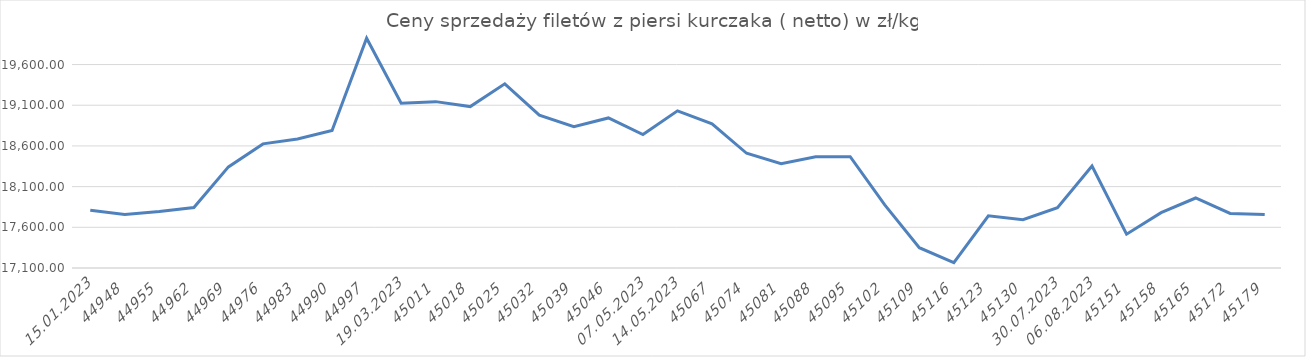
| Category | filety z piersi kurczaka |
|---|---|
| 15.01.2023 | 17810.023 |
| 22.01.2023 | 17757.926 |
| 29.01.2023 | 17793 |
| 05.02.2023 | 17843.588 |
| 12.02.2023 | 18342.585 |
| 19.02.2023 | 18625.115 |
| 26.02.2023 | 18684.334 |
| 05.03.2023 | 18790.139 |
| 12.03.2023 | 19923.104 |
| 19.03.2023 | 19124.42 |
| 26.03.2023 | 19144.344 |
| 02.04.2023 | 19083.679 |
| 09.04.2023 | 19363.01 |
| 16.04.2023 | 18978.751 |
| 23.04.2023 | 18835.817 |
| 30.04.2023 | 18943.698 |
| 07.05.2023 | 18739.473 |
| 14.05.2023 | 19031.403 |
| 21.05.2023 | 18870.303 |
| 28.05.2023 | 18509.819 |
| 04.06.2023 | 18381.437 |
| 11.06.2023 | 18466.889 |
| 18.06.2023 | 18467.889 |
| 25.06.2023 | 17874.914 |
| 02.07.2023 | 17349.174 |
| 09.07.2023 | 17165.546 |
| 16.07.2023 | 17741.248 |
| 23.07.2023 | 17694.338 |
| 30.07.2023 | 17841.429 |
| 06.08.2023 | 18352.509 |
| 13.08.2023 | 17515.366 |
| 20.08.2023 | 17780.664 |
| 27.08.2023 | 17960.235 |
| 03.09.2023 | 17770.977 |
| 10.09.2023 | 17757.167 |